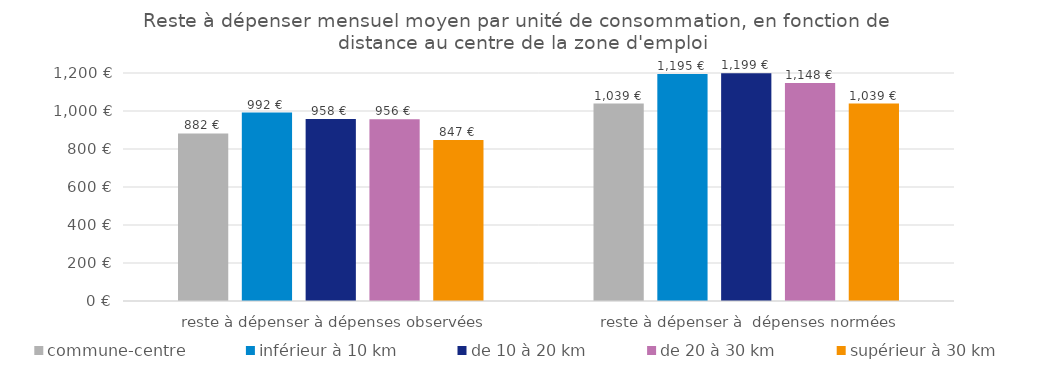
| Category | commune-centre | inférieur à 10 km | de 10 à 20 km | de 20 à 30 km | supérieur à 30 km |
|---|---|---|---|---|---|
| reste à dépenser à dépenses observées | 882 | 992 | 958 | 956 | 847 |
| reste à dépenser à  dépenses normées | 1039 | 1195 | 1199 | 1148 | 1039 |